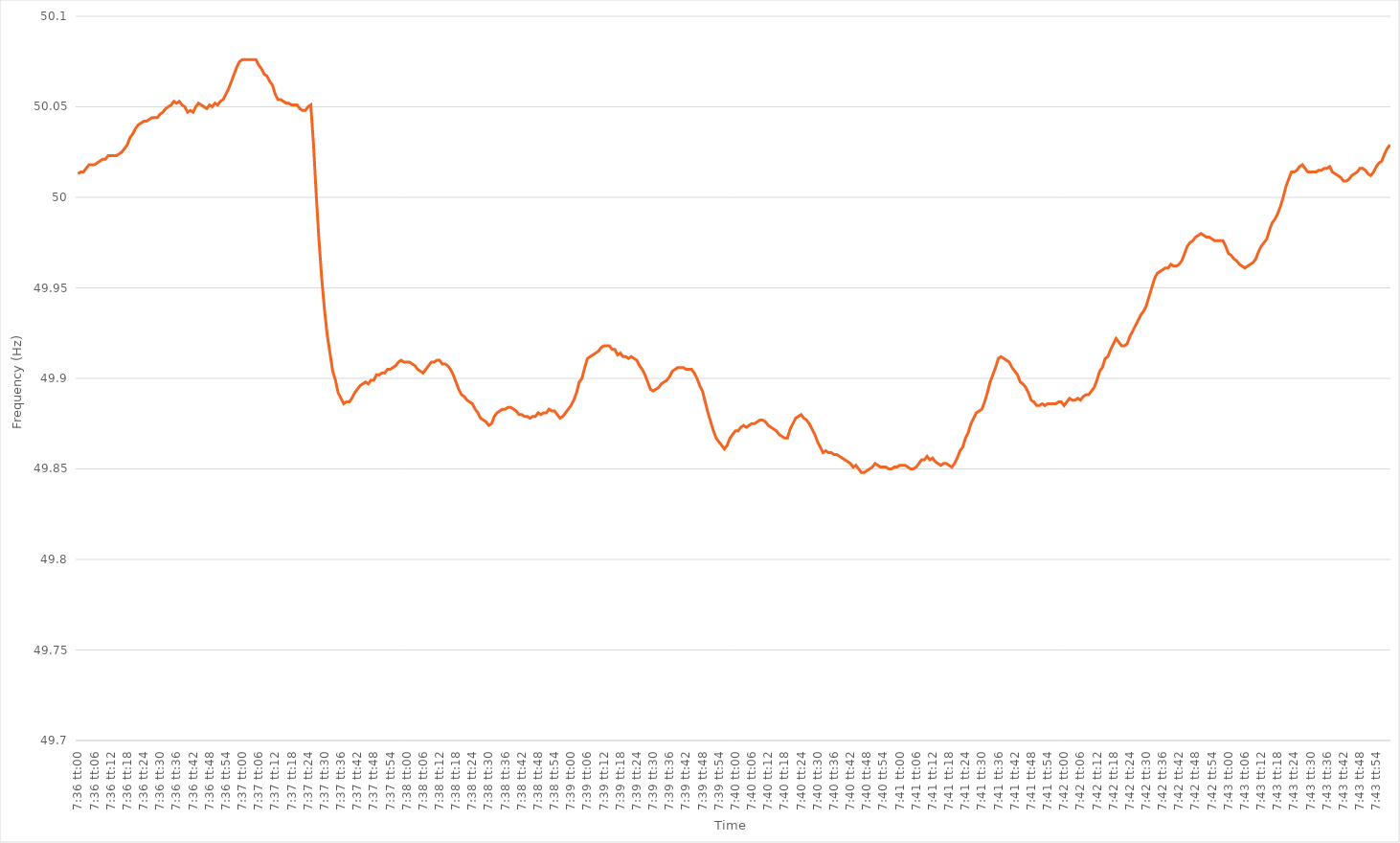
| Category | Series 0 |
|---|---|
| 0.31666666666666665 | 50.013 |
| 0.31667824074074075 | 50.014 |
| 0.3166898148148148 | 50.014 |
| 0.3167013888888889 | 50.016 |
| 0.316712962962963 | 50.018 |
| 0.316724537037037 | 50.018 |
| 0.3167361111111111 | 50.018 |
| 0.3167476851851852 | 50.019 |
| 0.31675925925925924 | 50.02 |
| 0.31677083333333333 | 50.021 |
| 0.31678240740740743 | 50.021 |
| 0.31679398148148147 | 50.023 |
| 0.31680555555555556 | 50.023 |
| 0.31681712962962966 | 50.023 |
| 0.3168287037037037 | 50.023 |
| 0.3168402777777778 | 50.024 |
| 0.3168518518518519 | 50.025 |
| 0.3168634259259259 | 50.027 |
| 0.316875 | 50.029 |
| 0.31688657407407406 | 50.033 |
| 0.31689814814814815 | 50.035 |
| 0.3169097222222222 | 50.038 |
| 0.3169212962962963 | 50.04 |
| 0.3169328703703704 | 50.041 |
| 0.3169444444444444 | 50.042 |
| 0.3169560185185185 | 50.042 |
| 0.3169675925925926 | 50.043 |
| 0.31697916666666665 | 50.044 |
| 0.31699074074074074 | 50.044 |
| 0.31700231481481483 | 50.044 |
| 0.3170138888888889 | 50.046 |
| 0.31702546296296297 | 50.047 |
| 0.31703703703703706 | 50.049 |
| 0.3170486111111111 | 50.05 |
| 0.3170601851851852 | 50.051 |
| 0.3170717592592593 | 50.053 |
| 0.31708333333333333 | 50.052 |
| 0.3170949074074074 | 50.053 |
| 0.31710648148148146 | 50.051 |
| 0.31711805555555556 | 50.05 |
| 0.3171296296296296 | 50.047 |
| 0.3171412037037037 | 50.048 |
| 0.3171527777777778 | 50.047 |
| 0.3171643518518518 | 50.05 |
| 0.3171759259259259 | 50.052 |
| 0.3171875 | 50.051 |
| 0.31719907407407405 | 50.05 |
| 0.31721064814814814 | 50.049 |
| 0.31722222222222224 | 50.051 |
| 0.3172337962962963 | 50.05 |
| 0.31724537037037037 | 50.052 |
| 0.31725694444444447 | 50.051 |
| 0.3172685185185185 | 50.053 |
| 0.3172800925925926 | 50.054 |
| 0.3172916666666667 | 50.057 |
| 0.31730324074074073 | 50.06 |
| 0.3173148148148148 | 50.064 |
| 0.3173263888888889 | 50.068 |
| 0.31733796296296296 | 50.072 |
| 0.317349537037037 | 50.075 |
| 0.31736111111111115 | 50.076 |
| 0.3173726851851852 | 50.076 |
| 0.3173842592592592 | 50.076 |
| 0.3173958333333333 | 50.076 |
| 0.3174074074074074 | 50.076 |
| 0.31741898148148145 | 50.076 |
| 0.31743055555555555 | 50.073 |
| 0.31744212962962964 | 50.071 |
| 0.3174537037037037 | 50.068 |
| 0.3174652777777778 | 50.067 |
| 0.31747685185185187 | 50.064 |
| 0.3174884259259259 | 50.062 |
| 0.3175 | 50.057 |
| 0.3175115740740741 | 50.054 |
| 0.31752314814814814 | 50.054 |
| 0.31753472222222223 | 50.053 |
| 0.3175462962962963 | 50.052 |
| 0.31755787037037037 | 50.052 |
| 0.3175694444444444 | 50.051 |
| 0.31758101851851855 | 50.051 |
| 0.3175925925925926 | 50.051 |
| 0.3176041666666667 | 50.049 |
| 0.3176157407407407 | 50.048 |
| 0.3176273148148148 | 50.048 |
| 0.31763888888888886 | 50.05 |
| 0.31765046296296295 | 50.051 |
| 0.31766203703703705 | 50.029 |
| 0.3176736111111111 | 50.001 |
| 0.3176851851851852 | 49.976 |
| 0.3176967592592593 | 49.955 |
| 0.3177083333333333 | 49.938 |
| 0.3177199074074074 | 49.924 |
| 0.3177314814814815 | 49.914 |
| 0.31774305555555554 | 49.904 |
| 0.31775462962962964 | 49.899 |
| 0.31776620370370373 | 49.892 |
| 0.31777777777777777 | 49.889 |
| 0.31778935185185186 | 49.886 |
| 0.31780092592592596 | 49.887 |
| 0.3178125 | 49.887 |
| 0.3178240740740741 | 49.889 |
| 0.31783564814814813 | 49.892 |
| 0.3178472222222222 | 49.894 |
| 0.31785879629629626 | 49.896 |
| 0.31787037037037036 | 49.897 |
| 0.31788194444444445 | 49.898 |
| 0.3178935185185185 | 49.897 |
| 0.3179050925925926 | 49.899 |
| 0.3179166666666667 | 49.899 |
| 0.3179282407407407 | 49.902 |
| 0.3179398148148148 | 49.902 |
| 0.3179513888888889 | 49.903 |
| 0.31796296296296295 | 49.903 |
| 0.31797453703703704 | 49.905 |
| 0.31798611111111114 | 49.905 |
| 0.3179976851851852 | 49.906 |
| 0.31800925925925927 | 49.907 |
| 0.31802083333333336 | 49.909 |
| 0.3180324074074074 | 49.91 |
| 0.3180439814814815 | 49.909 |
| 0.31805555555555554 | 49.909 |
| 0.31806712962962963 | 49.909 |
| 0.31807870370370367 | 49.908 |
| 0.31809027777777776 | 49.907 |
| 0.31810185185185186 | 49.905 |
| 0.3181134259259259 | 49.904 |
| 0.318125 | 49.903 |
| 0.3181365740740741 | 49.905 |
| 0.3181481481481481 | 49.907 |
| 0.3181597222222222 | 49.909 |
| 0.3181712962962963 | 49.909 |
| 0.31818287037037035 | 49.91 |
| 0.31819444444444445 | 49.91 |
| 0.31820601851851854 | 49.908 |
| 0.3182175925925926 | 49.908 |
| 0.3182291666666667 | 49.907 |
| 0.31824074074074077 | 49.905 |
| 0.3182523148148148 | 49.902 |
| 0.3182638888888889 | 49.898 |
| 0.318275462962963 | 49.894 |
| 0.31828703703703703 | 49.891 |
| 0.3182986111111111 | 49.89 |
| 0.3183101851851852 | 49.888 |
| 0.31832175925925926 | 49.887 |
| 0.3183333333333333 | 49.886 |
| 0.3183449074074074 | 49.883 |
| 0.3183564814814815 | 49.881 |
| 0.31836805555555553 | 49.878 |
| 0.3183796296296296 | 49.877 |
| 0.3183912037037037 | 49.876 |
| 0.31840277777777776 | 49.874 |
| 0.31841435185185185 | 49.875 |
| 0.31842592592592595 | 49.879 |
| 0.3184375 | 49.881 |
| 0.3184490740740741 | 49.882 |
| 0.3184606481481482 | 49.883 |
| 0.3184722222222222 | 49.883 |
| 0.3184837962962963 | 49.884 |
| 0.3184953703703704 | 49.884 |
| 0.31850694444444444 | 49.883 |
| 0.3185185185185185 | 49.882 |
| 0.31853009259259263 | 49.88 |
| 0.31854166666666667 | 49.88 |
| 0.31855324074074076 | 49.879 |
| 0.3185648148148148 | 49.879 |
| 0.3185763888888889 | 49.878 |
| 0.31858796296296293 | 49.879 |
| 0.31859953703703703 | 49.879 |
| 0.3186111111111111 | 49.881 |
| 0.31862268518518516 | 49.88 |
| 0.31863425925925926 | 49.881 |
| 0.31864583333333335 | 49.881 |
| 0.3186574074074074 | 49.883 |
| 0.3186689814814815 | 49.882 |
| 0.3186805555555556 | 49.882 |
| 0.3186921296296296 | 49.88 |
| 0.3187037037037037 | 49.878 |
| 0.3187152777777778 | 49.879 |
| 0.31872685185185184 | 49.881 |
| 0.31873842592592594 | 49.883 |
| 0.31875000000000003 | 49.885 |
| 0.31876157407407407 | 49.888 |
| 0.31877314814814817 | 49.892 |
| 0.3187847222222222 | 49.898 |
| 0.3187962962962963 | 49.9 |
| 0.31880787037037034 | 49.906 |
| 0.31881944444444443 | 49.911 |
| 0.3188310185185185 | 49.912 |
| 0.31884259259259257 | 49.913 |
| 0.31885416666666666 | 49.914 |
| 0.31886574074074076 | 49.915 |
| 0.3188773148148148 | 49.917 |
| 0.3188888888888889 | 49.918 |
| 0.318900462962963 | 49.918 |
| 0.318912037037037 | 49.918 |
| 0.3189236111111111 | 49.916 |
| 0.3189351851851852 | 49.916 |
| 0.31894675925925925 | 49.913 |
| 0.31895833333333334 | 49.914 |
| 0.31896990740740744 | 49.912 |
| 0.3189814814814815 | 49.912 |
| 0.31899305555555557 | 49.911 |
| 0.3190046296296296 | 49.912 |
| 0.3190162037037037 | 49.911 |
| 0.31902777777777774 | 49.91 |
| 0.31903935185185184 | 49.907 |
| 0.31905092592592593 | 49.905 |
| 0.31906249999999997 | 49.902 |
| 0.31907407407407407 | 49.898 |
| 0.31908564814814816 | 49.894 |
| 0.3190972222222222 | 49.893 |
| 0.3191087962962963 | 49.894 |
| 0.3191203703703704 | 49.895 |
| 0.3191319444444444 | 49.897 |
| 0.3191435185185185 | 49.898 |
| 0.3191550925925926 | 49.899 |
| 0.31916666666666665 | 49.901 |
| 0.31917824074074075 | 49.904 |
| 0.31918981481481484 | 49.905 |
| 0.3192013888888889 | 49.906 |
| 0.319212962962963 | 49.906 |
| 0.319224537037037 | 49.906 |
| 0.3192361111111111 | 49.905 |
| 0.31924768518518515 | 49.905 |
| 0.3192592592592593 | 49.905 |
| 0.31927083333333334 | 49.903 |
| 0.3192824074074074 | 49.9 |
| 0.31929398148148147 | 49.896 |
| 0.31930555555555556 | 49.893 |
| 0.3193171296296296 | 49.887 |
| 0.3193287037037037 | 49.881 |
| 0.3193402777777778 | 49.876 |
| 0.31935185185185183 | 49.871 |
| 0.3193634259259259 | 49.867 |
| 0.319375 | 49.865 |
| 0.31938657407407406 | 49.863 |
| 0.31939814814814815 | 49.861 |
| 0.31940972222222225 | 49.863 |
| 0.3194212962962963 | 49.867 |
| 0.3194328703703704 | 49.869 |
| 0.3194444444444445 | 49.871 |
| 0.3194560185185185 | 49.871 |
| 0.31946759259259255 | 49.873 |
| 0.3194791666666667 | 49.874 |
| 0.31949074074074074 | 49.873 |
| 0.31950231481481484 | 49.874 |
| 0.3195138888888889 | 49.875 |
| 0.31952546296296297 | 49.875 |
| 0.319537037037037 | 49.876 |
| 0.3195486111111111 | 49.877 |
| 0.3195601851851852 | 49.877 |
| 0.31957175925925924 | 49.876 |
| 0.31958333333333333 | 49.874 |
| 0.3195949074074074 | 49.873 |
| 0.31960648148148146 | 49.872 |
| 0.31961805555555556 | 49.871 |
| 0.31962962962962965 | 49.869 |
| 0.3196412037037037 | 49.868 |
| 0.3196527777777778 | 49.867 |
| 0.3196643518518519 | 49.867 |
| 0.3196759259259259 | 49.872 |
| 0.3196875 | 49.875 |
| 0.3196990740740741 | 49.878 |
| 0.31971064814814815 | 49.879 |
| 0.31972222222222224 | 49.88 |
| 0.3197337962962963 | 49.878 |
| 0.3197453703703704 | 49.877 |
| 0.3197569444444444 | 49.875 |
| 0.3197685185185185 | 49.872 |
| 0.3197800925925926 | 49.869 |
| 0.31979166666666664 | 49.865 |
| 0.31980324074074074 | 49.862 |
| 0.31981481481481483 | 49.859 |
| 0.31982638888888887 | 49.86 |
| 0.31983796296296296 | 49.859 |
| 0.31984953703703706 | 49.859 |
| 0.3198611111111111 | 49.858 |
| 0.3198726851851852 | 49.858 |
| 0.3198842592592593 | 49.857 |
| 0.3198958333333333 | 49.856 |
| 0.3199074074074074 | 49.855 |
| 0.3199189814814815 | 49.854 |
| 0.31993055555555555 | 49.853 |
| 0.31994212962962965 | 49.851 |
| 0.3199537037037037 | 49.852 |
| 0.3199652777777778 | 49.85 |
| 0.3199768518518518 | 49.848 |
| 0.3199884259259259 | 49.848 |
| 0.32 | 49.849 |
| 0.32001157407407405 | 49.85 |
| 0.32002314814814814 | 49.851 |
| 0.32003472222222223 | 49.853 |
| 0.3200462962962963 | 49.852 |
| 0.32005787037037037 | 49.851 |
| 0.32006944444444446 | 49.851 |
| 0.3200810185185185 | 49.851 |
| 0.3200925925925926 | 49.85 |
| 0.3201041666666667 | 49.85 |
| 0.32011574074074073 | 49.851 |
| 0.3201273148148148 | 49.851 |
| 0.3201388888888889 | 49.852 |
| 0.32015046296296296 | 49.852 |
| 0.32016203703703705 | 49.852 |
| 0.3201736111111111 | 49.851 |
| 0.3201851851851852 | 49.85 |
| 0.3201967592592592 | 49.85 |
| 0.3202083333333334 | 49.851 |
| 0.3202199074074074 | 49.853 |
| 0.32023148148148145 | 49.855 |
| 0.32024305555555554 | 49.855 |
| 0.32025462962962964 | 49.857 |
| 0.3202662037037037 | 49.855 |
| 0.3202777777777778 | 49.856 |
| 0.32028935185185187 | 49.854 |
| 0.3203009259259259 | 49.853 |
| 0.3203125 | 49.852 |
| 0.3203240740740741 | 49.853 |
| 0.32033564814814813 | 49.853 |
| 0.3203472222222222 | 49.852 |
| 0.3203587962962963 | 49.851 |
| 0.32037037037037036 | 49.853 |
| 0.32038194444444446 | 49.856 |
| 0.32039351851851855 | 49.86 |
| 0.3204050925925926 | 49.862 |
| 0.3204166666666666 | 49.867 |
| 0.3204282407407408 | 49.87 |
| 0.3204398148148148 | 49.875 |
| 0.3204513888888889 | 49.878 |
| 0.32046296296296295 | 49.881 |
| 0.32047453703703704 | 49.882 |
| 0.3204861111111111 | 49.883 |
| 0.3204976851851852 | 49.887 |
| 0.32050925925925927 | 49.892 |
| 0.3205208333333333 | 49.898 |
| 0.3205324074074074 | 49.902 |
| 0.3205439814814815 | 49.906 |
| 0.32055555555555554 | 49.911 |
| 0.32056712962962963 | 49.912 |
| 0.3205787037037037 | 49.911 |
| 0.32059027777777777 | 49.91 |
| 0.32060185185185186 | 49.909 |
| 0.32061342592592595 | 49.906 |
| 0.320625 | 49.904 |
| 0.3206365740740741 | 49.902 |
| 0.3206481481481482 | 49.898 |
| 0.3206597222222222 | 49.897 |
| 0.3206712962962963 | 49.895 |
| 0.32068287037037035 | 49.892 |
| 0.32069444444444445 | 49.888 |
| 0.3207060185185185 | 49.887 |
| 0.3207175925925926 | 49.885 |
| 0.3207291666666667 | 49.885 |
| 0.3207407407407407 | 49.886 |
| 0.3207523148148148 | 49.885 |
| 0.3207638888888889 | 49.886 |
| 0.32077546296296294 | 49.886 |
| 0.32078703703703704 | 49.886 |
| 0.32079861111111113 | 49.886 |
| 0.32081018518518517 | 49.887 |
| 0.32082175925925926 | 49.887 |
| 0.32083333333333336 | 49.885 |
| 0.3208449074074074 | 49.887 |
| 0.3208564814814815 | 49.889 |
| 0.3208680555555556 | 49.888 |
| 0.3208796296296296 | 49.888 |
| 0.3208912037037037 | 49.889 |
| 0.32090277777777776 | 49.888 |
| 0.32091435185185185 | 49.89 |
| 0.3209259259259259 | 49.891 |
| 0.3209375 | 49.891 |
| 0.3209490740740741 | 49.893 |
| 0.3209606481481481 | 49.895 |
| 0.3209722222222222 | 49.899 |
| 0.3209837962962963 | 49.904 |
| 0.32099537037037035 | 49.906 |
| 0.32100694444444444 | 49.911 |
| 0.32101851851851854 | 49.912 |
| 0.3210300925925926 | 49.916 |
| 0.32104166666666667 | 49.919 |
| 0.32105324074074076 | 49.922 |
| 0.3210648148148148 | 49.92 |
| 0.3210763888888889 | 49.918 |
| 0.321087962962963 | 49.918 |
| 0.32109953703703703 | 49.919 |
| 0.3211111111111111 | 49.923 |
| 0.32112268518518516 | 49.926 |
| 0.32113425925925926 | 49.929 |
| 0.3211458333333333 | 49.932 |
| 0.32115740740740745 | 49.935 |
| 0.3211689814814815 | 49.937 |
| 0.3211805555555555 | 49.94 |
| 0.3211921296296296 | 49.945 |
| 0.3212037037037037 | 49.95 |
| 0.32121527777777775 | 49.955 |
| 0.32122685185185185 | 49.958 |
| 0.32123842592592594 | 49.959 |
| 0.32125 | 49.96 |
| 0.3212615740740741 | 49.961 |
| 0.32127314814814817 | 49.961 |
| 0.3212847222222222 | 49.963 |
| 0.3212962962962963 | 49.962 |
| 0.3213078703703704 | 49.962 |
| 0.32131944444444444 | 49.963 |
| 0.32133101851851853 | 49.965 |
| 0.3213425925925926 | 49.969 |
| 0.32135416666666666 | 49.973 |
| 0.3213657407407407 | 49.975 |
| 0.32137731481481485 | 49.976 |
| 0.3213888888888889 | 49.978 |
| 0.321400462962963 | 49.979 |
| 0.321412037037037 | 49.98 |
| 0.3214236111111111 | 49.979 |
| 0.32143518518518516 | 49.978 |
| 0.32144675925925925 | 49.978 |
| 0.32145833333333335 | 49.977 |
| 0.3214699074074074 | 49.976 |
| 0.3214814814814815 | 49.976 |
| 0.3214930555555556 | 49.976 |
| 0.3215046296296296 | 49.976 |
| 0.3215162037037037 | 49.973 |
| 0.3215277777777778 | 49.969 |
| 0.32153935185185184 | 49.968 |
| 0.32155092592592593 | 49.966 |
| 0.32156250000000003 | 49.965 |
| 0.32157407407407407 | 49.963 |
| 0.32158564814814816 | 49.962 |
| 0.32159722222222226 | 49.961 |
| 0.3216087962962963 | 49.962 |
| 0.3216203703703704 | 49.963 |
| 0.32163194444444443 | 49.964 |
| 0.3216435185185185 | 49.966 |
| 0.32165509259259256 | 49.97 |
| 0.32166666666666666 | 49.973 |
| 0.32167824074074075 | 49.975 |
| 0.3216898148148148 | 49.977 |
| 0.3217013888888889 | 49.982 |
| 0.321712962962963 | 49.986 |
| 0.321724537037037 | 49.988 |
| 0.3217361111111111 | 49.991 |
| 0.3217476851851852 | 49.995 |
| 0.32175925925925924 | 50 |
| 0.32177083333333334 | 50.006 |
| 0.32178240740740743 | 50.01 |
| 0.3217939814814815 | 50.014 |
| 0.32180555555555557 | 50.014 |
| 0.32181712962962966 | 50.015 |
| 0.3218287037037037 | 50.017 |
| 0.3218402777777778 | 50.018 |
| 0.32185185185185183 | 50.016 |
| 0.32186342592592593 | 50.014 |
| 0.32187499999999997 | 50.014 |
| 0.32188657407407406 | 50.014 |
| 0.32189814814814816 | 50.014 |
| 0.3219097222222222 | 50.015 |
| 0.3219212962962963 | 50.015 |
| 0.3219328703703704 | 50.016 |
| 0.3219444444444444 | 50.016 |
| 0.3219560185185185 | 50.017 |
| 0.3219675925925926 | 50.014 |
| 0.32197916666666665 | 50.013 |
| 0.32199074074074074 | 50.012 |
| 0.32200231481481484 | 50.011 |
| 0.3220138888888889 | 50.009 |
| 0.32202546296296297 | 50.009 |
| 0.32203703703703707 | 50.01 |
| 0.3220486111111111 | 50.012 |
| 0.3220601851851852 | 50.013 |
| 0.32207175925925924 | 50.014 |
| 0.32208333333333333 | 50.016 |
| 0.32209490740740737 | 50.016 |
| 0.3221064814814815 | 50.015 |
| 0.32211805555555556 | 50.013 |
| 0.3221296296296296 | 50.012 |
| 0.3221412037037037 | 50.014 |
| 0.3221527777777778 | 50.017 |
| 0.3221643518518518 | 50.019 |
| 0.3221759259259259 | 50.02 |
| 0.3221875 | 50.024 |
| 0.32219907407407405 | 50.027 |
| 0.32221064814814815 | 50.029 |